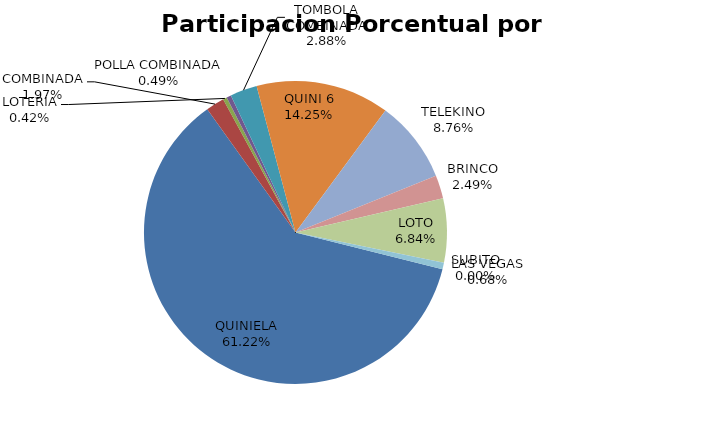
| Category | Series 0 |
|---|---|
| QUINIELA | 2347871 |
| COMBINADA | 75667 |
| LOTERIA | 15977 |
| POLLA COMBINADA | 18899 |
| TOMBOLA COMBINADA | 110299 |
| QUINI 6 | 546546 |
| TELEKINO | 335966 |
| BRINCO | 95687 |
| LOTO | 262235 |
| SUBITO | 0 |
| LAS VEGAS | 26113 |